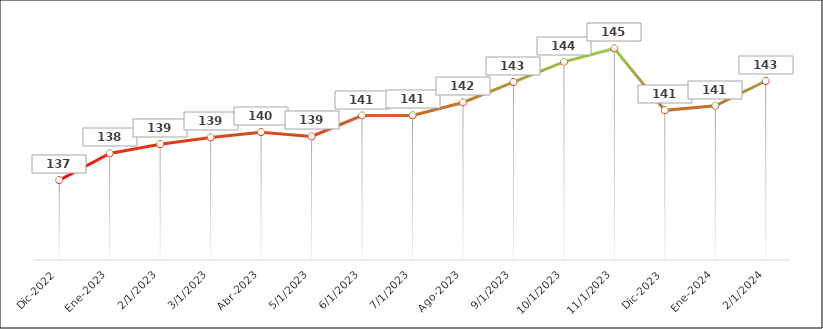
| Category |  Índice   |
|---|---|
| Dic-2022 | 137105 |
| Ene-2023 | 138820 |
| Feb-2023 | 139410 |
| Mar-2023 | 139841 |
| Abr-2023 | 140182 |
| May-2023 | 139905 |
| Jun-2023 | 141245 |
| Jul-2023 | 141252 |
| Ago-2023 | 142081 |
| Sep-2023 | 143390 |
| Oct-2023 | 144679 |
| Nov-2023 | 145539 |
| Dic-2023 | 141577 |
| Ene-2024 | 141865 |
| Feb-2024 | 143456 |